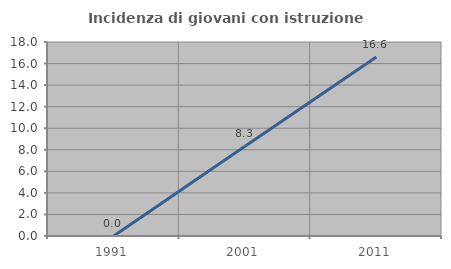
| Category | Incidenza di giovani con istruzione universitaria |
|---|---|
| 1991.0 | 0 |
| 2001.0 | 8.333 |
| 2011.0 | 16.606 |